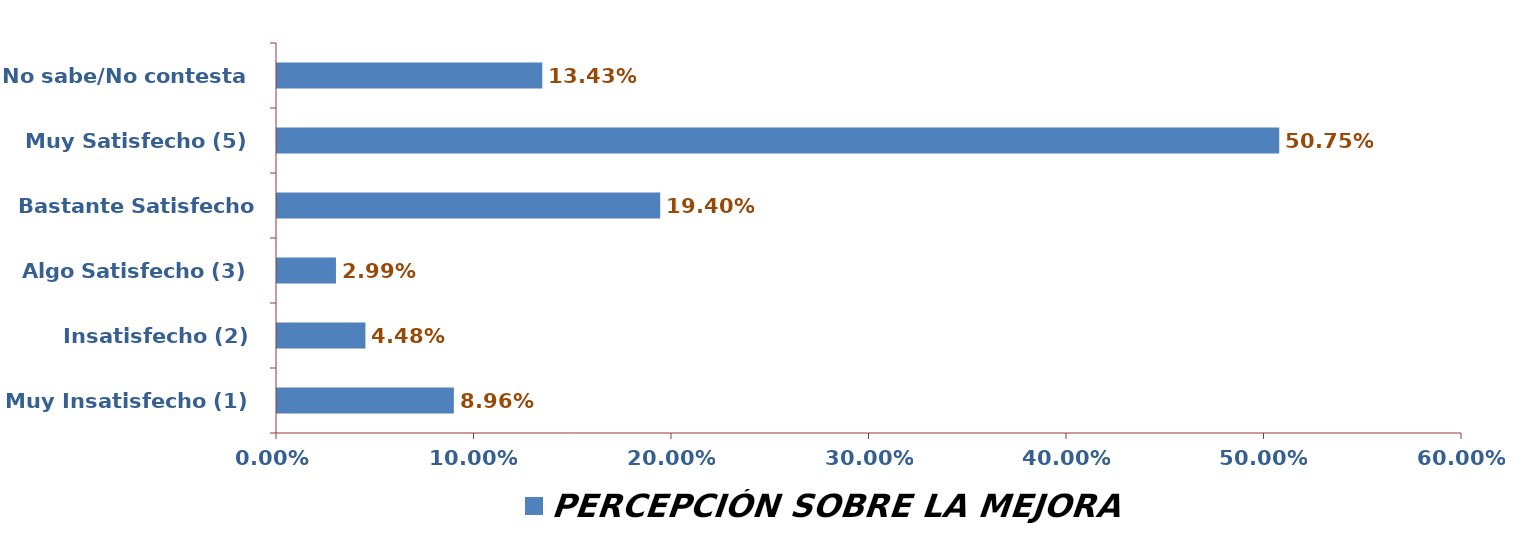
| Category | PERCEPCIÓN SOBRE LA MEJORA |
|---|---|
| Muy Insatisfecho (1) | 0.09 |
| Insatisfecho (2) | 0.045 |
| Algo Satisfecho (3) | 0.03 |
| Bastante Satisfecho (4) | 0.194 |
| Muy Satisfecho (5) | 0.507 |
| No sabe/No contesta | 0.134 |